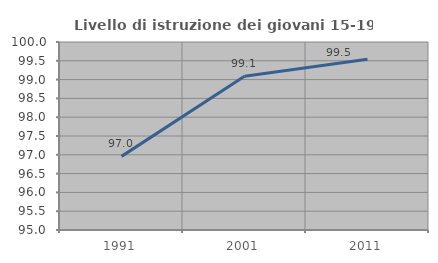
| Category | Livello di istruzione dei giovani 15-19 anni |
|---|---|
| 1991.0 | 96.958 |
| 2001.0 | 99.087 |
| 2011.0 | 99.541 |